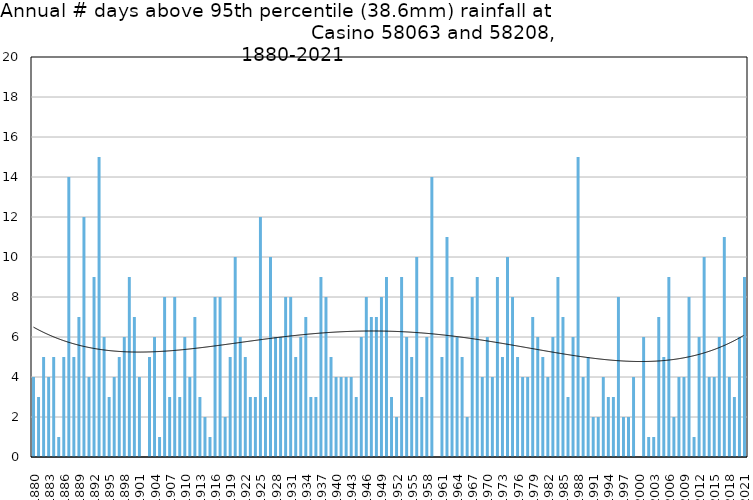
| Category | Annual # days above 95th percentile |
|---|---|
| 1880 | 4 |
| 1881 | 3 |
| 1882 | 5 |
| 1883 | 4 |
| 1884 | 5 |
| 1885 | 1 |
| 1886 | 5 |
| 1887 | 14 |
| 1888 | 5 |
| 1889 | 7 |
| 1890 | 12 |
| 1891 | 4 |
| 1892 | 9 |
| 1893 | 15 |
| 1894 | 6 |
| 1895 | 3 |
| 1896 | 4 |
| 1897 | 5 |
| 1898 | 6 |
| 1899 | 9 |
| 1900 | 7 |
| 1901 | 4 |
| 1902 | 0 |
| 1903 | 5 |
| 1904 | 6 |
| 1905 | 1 |
| 1906 | 8 |
| 1907 | 3 |
| 1908 | 8 |
| 1909 | 3 |
| 1910 | 6 |
| 1911 | 4 |
| 1912 | 7 |
| 1913 | 3 |
| 1914 | 2 |
| 1915 | 1 |
| 1916 | 8 |
| 1917 | 8 |
| 1918 | 2 |
| 1919 | 5 |
| 1920 | 10 |
| 1921 | 6 |
| 1922 | 5 |
| 1923 | 3 |
| 1924 | 3 |
| 1925 | 12 |
| 1926 | 3 |
| 1927 | 10 |
| 1928 | 6 |
| 1929 | 6 |
| 1930 | 8 |
| 1931 | 8 |
| 1932 | 5 |
| 1933 | 6 |
| 1934 | 7 |
| 1935 | 3 |
| 1936 | 3 |
| 1937 | 9 |
| 1938 | 8 |
| 1939 | 5 |
| 1940 | 4 |
| 1941 | 4 |
| 1942 | 4 |
| 1943 | 4 |
| 1944 | 3 |
| 1945 | 6 |
| 1946 | 8 |
| 1947 | 7 |
| 1948 | 7 |
| 1949 | 8 |
| 1950 | 9 |
| 1951 | 3 |
| 1952 | 2 |
| 1953 | 9 |
| 1954 | 6 |
| 1955 | 5 |
| 1956 | 10 |
| 1957 | 3 |
| 1958 | 6 |
| 1959 | 14 |
| 1960 | 0 |
| 1961 | 5 |
| 1962 | 11 |
| 1963 | 9 |
| 1964 | 6 |
| 1965 | 5 |
| 1966 | 2 |
| 1967 | 8 |
| 1968 | 9 |
| 1969 | 4 |
| 1970 | 6 |
| 1971 | 4 |
| 1972 | 9 |
| 1973 | 5 |
| 1974 | 10 |
| 1975 | 8 |
| 1976 | 5 |
| 1977 | 4 |
| 1978 | 4 |
| 1979 | 7 |
| 1980 | 6 |
| 1981 | 5 |
| 1982 | 4 |
| 1983 | 6 |
| 1984 | 9 |
| 1985 | 7 |
| 1986 | 3 |
| 1987 | 6 |
| 1988 | 15 |
| 1989 | 4 |
| 1990 | 5 |
| 1991 | 2 |
| 1992 | 2 |
| 1993 | 4 |
| 1994 | 3 |
| 1995 | 3 |
| 1996 | 8 |
| 1997 | 2 |
| 1998 | 2 |
| 1999 | 4 |
| 2000 | 0 |
| 2001 | 6 |
| 2002 | 1 |
| 2003 | 1 |
| 2004 | 7 |
| 2005 | 5 |
| 2006 | 9 |
| 2007 | 2 |
| 2008 | 4 |
| 2009 | 4 |
| 2010 | 8 |
| 2011 | 1 |
| 2012 | 6 |
| 2013 | 10 |
| 2014 | 4 |
| 2015 | 4 |
| 2016 | 6 |
| 2017 | 11 |
| 2018 | 4 |
| 2019 | 3 |
| 2020 | 6 |
| 2021 | 9 |